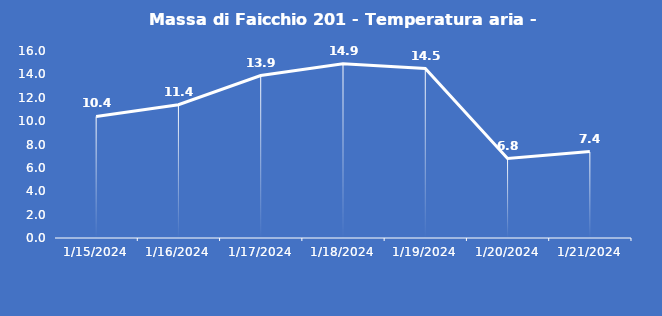
| Category | Massa di Faicchio 201 - Temperatura aria - Grezzo (°C) |
|---|---|
| 1/15/24 | 10.4 |
| 1/16/24 | 11.4 |
| 1/17/24 | 13.9 |
| 1/18/24 | 14.9 |
| 1/19/24 | 14.5 |
| 1/20/24 | 6.8 |
| 1/21/24 | 7.4 |